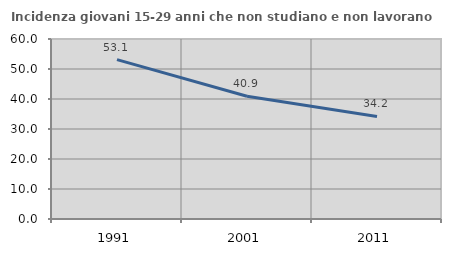
| Category | Incidenza giovani 15-29 anni che non studiano e non lavorano  |
|---|---|
| 1991.0 | 53.138 |
| 2001.0 | 40.909 |
| 2011.0 | 34.177 |